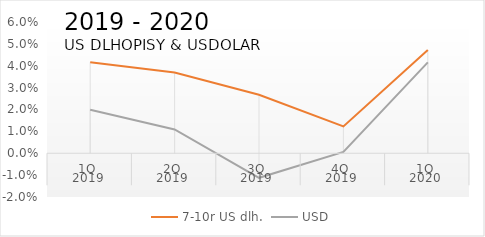
| Category | 7-10r US dlh. | USD |
|---|---|---|
| 0 | 0.042 | 0.02 |
| 1 | 0.037 | 0.011 |
| 2 | 0.027 | -0.011 |
| 3 | 0.012 | 0.001 |
| 4 | 0.047 | 0.042 |